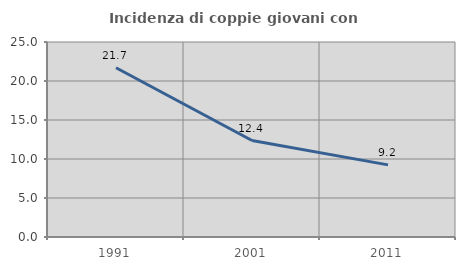
| Category | Incidenza di coppie giovani con figli |
|---|---|
| 1991.0 | 21.698 |
| 2001.0 | 12.368 |
| 2011.0 | 9.249 |